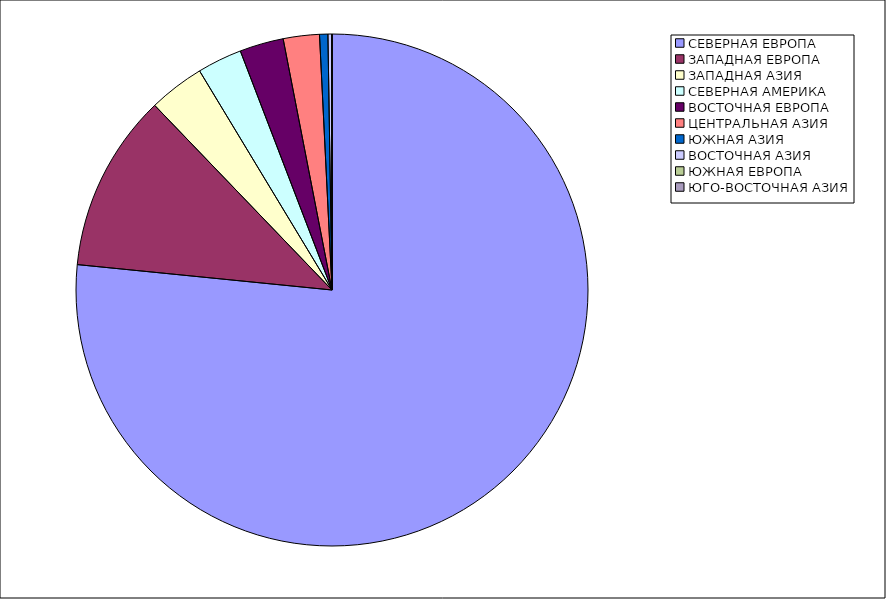
| Category | Оборот |
|---|---|
| СЕВЕРНАЯ ЕВРОПА | 76.583 |
| ЗАПАДНАЯ ЕВРОПА | 11.24 |
| ЗАПАДНАЯ АЗИЯ | 3.524 |
| СЕВЕРНАЯ АМЕРИКА | 2.824 |
| ВОСТОЧНАЯ ЕВРОПА | 2.77 |
| ЦЕНТРАЛЬНАЯ АЗИЯ | 2.28 |
| ЮЖНАЯ АЗИЯ | 0.525 |
| ВОСТОЧНАЯ АЗИЯ | 0.252 |
| ЮЖНАЯ ЕВРОПА | 0.002 |
| ЮГО-ВОСТОЧНАЯ АЗИЯ | 0 |